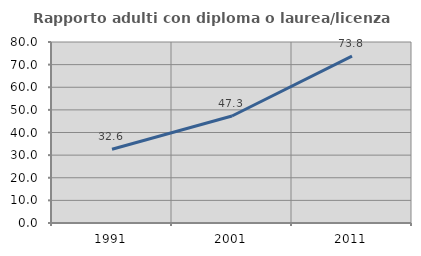
| Category | Rapporto adulti con diploma o laurea/licenza media  |
|---|---|
| 1991.0 | 32.62 |
| 2001.0 | 47.303 |
| 2011.0 | 73.77 |